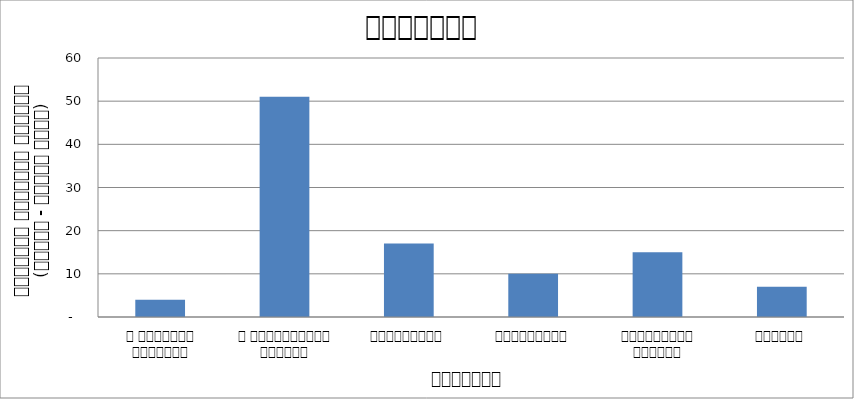
| Category | कुटनीति |
|---|---|
| द हिमालयन टाइम्स् | 4 |
| द काठमाण्डौं पोस्ट् | 51 |
| रिपब्लिका | 17 |
| कान्तिपुर | 10 |
| अन्नपूर्ण पोस्ट् | 15 |
| नागरिक | 7 |